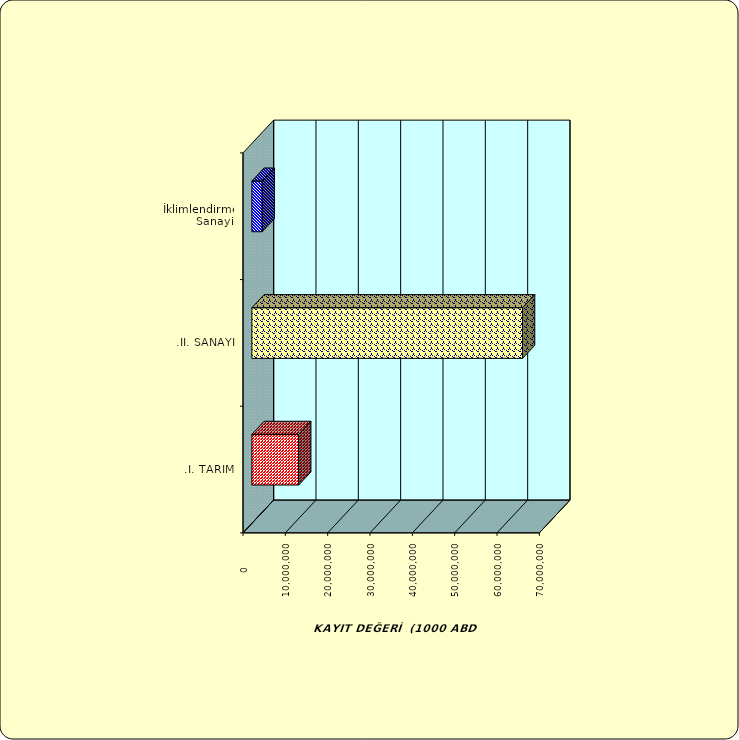
| Category | Series 0 |
|---|---|
| .I. TARIM | 11057201.936 |
| .II. SANAYİ | 63934542.66 |
|  İklimlendirme Sanayii | 2441396.779 |